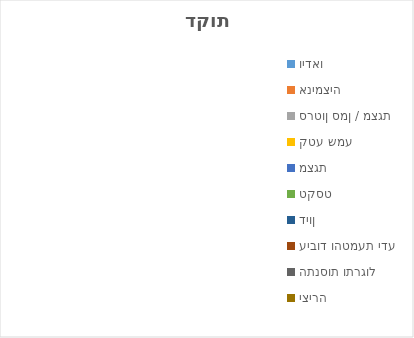
| Category | Series 0 |
|---|---|
| וידאו | 0 |
| אנימציה | 0 |
| סרטון סמן / מצגת | 0 |
| קטע שמע | 0 |
| מצגת | 0 |
| טקסט | 0 |
| דיון | 0 |
| עיבוד והטמעת ידע | 0 |
| התנסות ותרגול | 0 |
| יצירה | 0 |